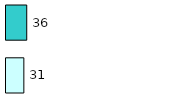
| Category | Series 0 | Series 1 |
|---|---|---|
| 0 | 31 | 36 |